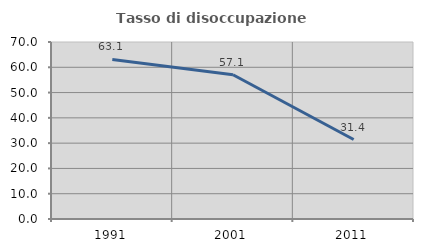
| Category | Tasso di disoccupazione giovanile  |
|---|---|
| 1991.0 | 63.1 |
| 2001.0 | 57.055 |
| 2011.0 | 31.429 |